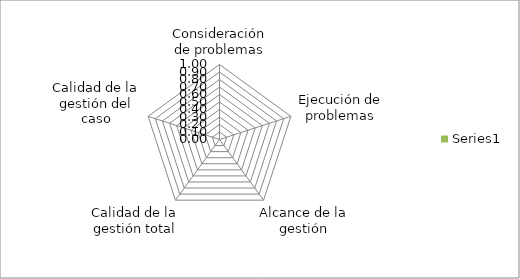
| Category | Series 0 |
|---|---|
| Consideración de problemas | 0 |
| Ejecución de problemas | 0 |
| Alcance de la gestión | 0 |
| Calidad de la gestión total | 0 |
| Calidad de la gestión del caso | 0 |